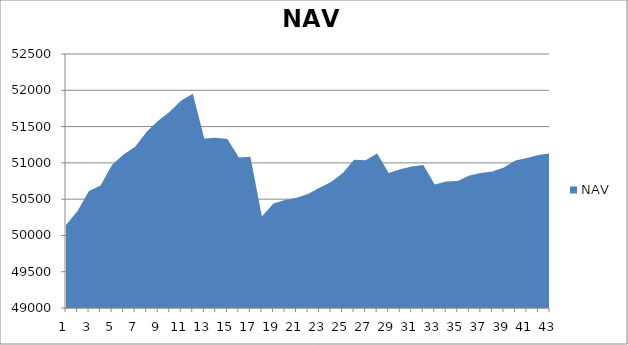
| Category | NAV |
|---|---|
| 0 | 50142.343 |
| 1 | 50336.57 |
| 2 | 50612.255 |
| 3 | 50687.913 |
| 4 | 50975.413 |
| 5 | 51115.874 |
| 6 | 51223.542 |
| 7 | 51427.364 |
| 8 | 51580.567 |
| 9 | 51704.692 |
| 10 | 51858.016 |
| 11 | 51951.766 |
| 12 | 51336.067 |
| 13 | 51345.356 |
| 14 | 51328.667 |
| 15 | 51072.985 |
| 16 | 51085.199 |
| 17 | 50261.67 |
| 18 | 50438.394 |
| 19 | 50489.896 |
| 20 | 50518.251 |
| 21 | 50572.468 |
| 22 | 50655.55 |
| 23 | 50737.787 |
| 24 | 50856.035 |
| 25 | 51041.806 |
| 26 | 51034.925 |
| 27 | 51128.589 |
| 28 | 50859.456 |
| 29 | 50911.137 |
| 30 | 50950.007 |
| 31 | 50970.175 |
| 32 | 50701.326 |
| 33 | 50743.495 |
| 34 | 50751.546 |
| 35 | 50826.725 |
| 36 | 50860.533 |
| 37 | 50879.283 |
| 38 | 50936.644 |
| 39 | 51031.381 |
| 40 | 51065.306 |
| 41 | 51109.987 |
| 42 | 51132.251 |